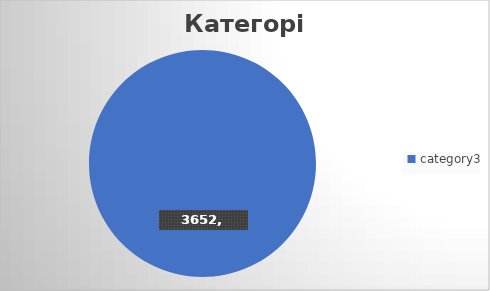
| Category | Підсумок |
|---|---|
| category3 | 3652 |